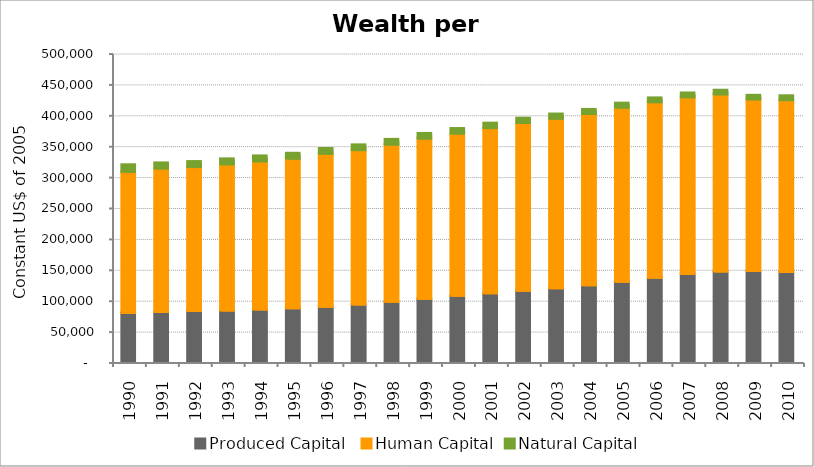
| Category | Produced Capital  | Human Capital | Natural Capital |
|---|---|---|---|
| 1990.0 | 79267.523 | 228571.482 | 11271.109 |
| 1991.0 | 80954.104 | 232217.749 | 8978.264 |
| 1992.0 | 82350.366 | 233118.833 | 8871.844 |
| 1993.0 | 83379.931 | 236508.9 | 8788.68 |
| 1994.0 | 84805.997 | 239969.385 | 8686.803 |
| 1995.0 | 86786.241 | 242345.472 | 8601.388 |
| 1996.0 | 89515.693 | 247496.501 | 8425.459 |
| 1997.0 | 93079.953 | 249777.933 | 8492.612 |
| 1998.0 | 97298.409 | 254559.147 | 8363.713 |
| 1999.0 | 102197.333 | 259379.616 | 8252.716 |
| 2000.0 | 107103.858 | 262560.067 | 8111.347 |
| 2001.0 | 111385.091 | 267108.811 | 7964.219 |
| 2002.0 | 115311.452 | 271469.168 | 7747.753 |
| 2003.0 | 119378.765 | 274295.82 | 7583.38 |
| 2004.0 | 124044.729 | 277326.979 | 7322.486 |
| 2005.0 | 130027.352 | 281644.802 | 7175.407 |
| 2006.0 | 136181.344 | 284181.85 | 6980.244 |
| 2007.0 | 142236.75 | 286203.04 | 6886.913 |
| 2008.0 | 146555.361 | 286526.544 | 6662.44 |
| 2009.0 | 147187.996 | 277810.532 | 6544.897 |
| 2010.0 | 145679.552 | 278062.267 | 7009.185 |